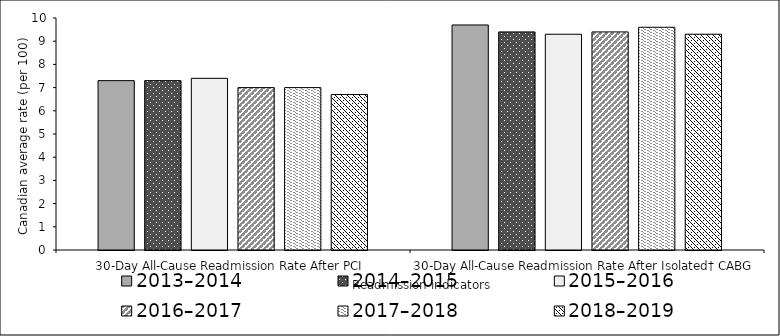
| Category | 2013–2014 | 2014–2015 | 2015–2016 | 2016–2017 | 2017–2018 | 2018–2019 |
|---|---|---|---|---|---|---|
| 30-Day All-Cause Readmission Rate After PCI | 7.3 | 7.3 | 7.4 | 7 | 7 | 6.7 |
| 30-Day All-Cause Readmission Rate After Isolated† CABG | 9.7 | 9.4 | 9.3 | 9.4 | 9.6 | 9.3 |